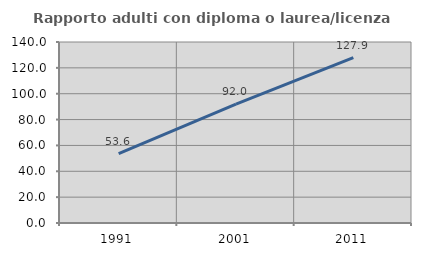
| Category | Rapporto adulti con diploma o laurea/licenza media  |
|---|---|
| 1991.0 | 53.589 |
| 2001.0 | 91.968 |
| 2011.0 | 127.907 |